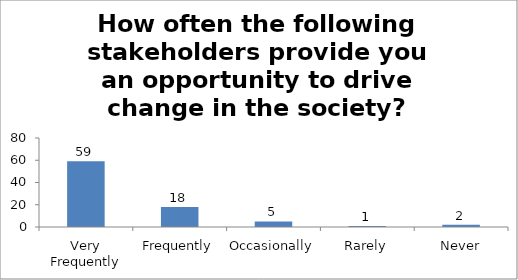
| Category | How often the following stakeholders provide you an opportunity to drive change in the society? (Parents) |
|---|---|
| Very Frequently | 59 |
| Frequently | 18 |
| Occasionally | 5 |
| Rarely | 1 |
| Never | 2 |